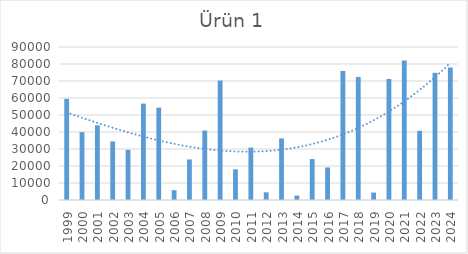
| Category | Ürün 1 |
|---|---|
| 1999.0 | 59471 |
| 2000.0 | 39936 |
| 2001.0 | 43946 |
| 2002.0 | 34456 |
| 2003.0 | 29544 |
| 2004.0 | 56706 |
| 2005.0 | 54311 |
| 2006.0 | 5756 |
| 2007.0 | 23859 |
| 2008.0 | 40864 |
| 2009.0 | 70292 |
| 2010.0 | 18045 |
| 2011.0 | 30839 |
| 2012.0 | 4516 |
| 2013.0 | 36204 |
| 2014.0 | 2604 |
| 2015.0 | 24079 |
| 2016.0 | 19148 |
| 2017.0 | 75953 |
| 2018.0 | 72399 |
| 2019.0 | 4382 |
| 2020.0 | 71196 |
| 2021.0 | 82053 |
| 2022.0 | 40703 |
| 2023.0 | 74797 |
| 2024.0 | 77989 |